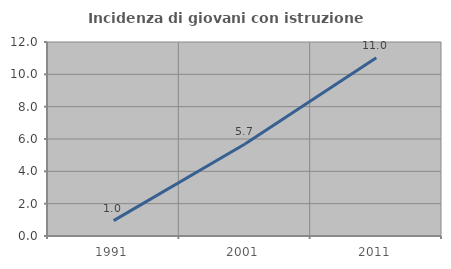
| Category | Incidenza di giovani con istruzione universitaria |
|---|---|
| 1991.0 | 0.952 |
| 2001.0 | 5.691 |
| 2011.0 | 11.024 |